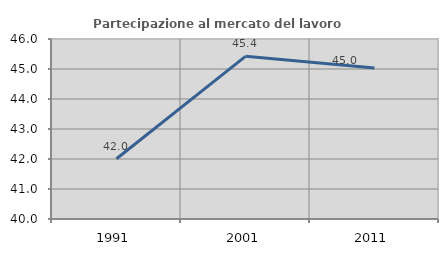
| Category | Partecipazione al mercato del lavoro  femminile |
|---|---|
| 1991.0 | 42.007 |
| 2001.0 | 45.423 |
| 2011.0 | 45.035 |